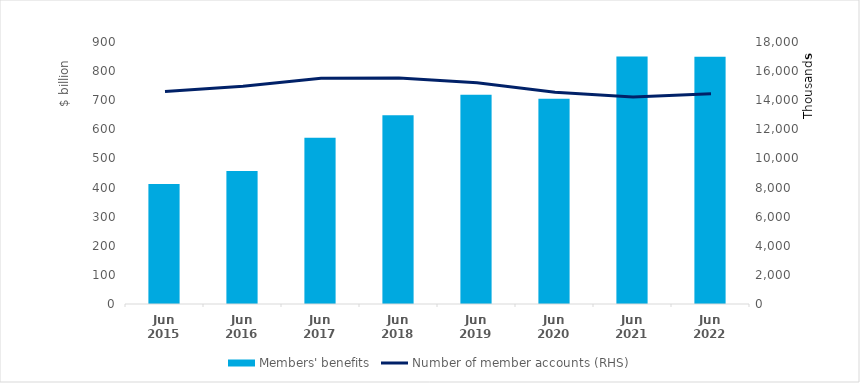
| Category | Members' benefits |
|---|---|
| Jun 2015 | 412 |
| Jun 2016 | 457 |
| Jun 2017 | 571 |
| Jun 2018 | 648 |
| Jun 2019 | 719 |
| Jun 2020 | 705 |
| Jun 2021 | 850 |
| Jun 2022 | 849 |